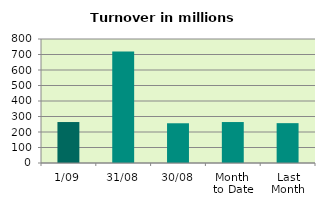
| Category | Series 0 |
|---|---|
| 1/09 | 264.299 |
| 31/08 | 719.063 |
| 30/08 | 256.338 |
| Month 
to Date | 264.299 |
| Last
Month | 257.061 |